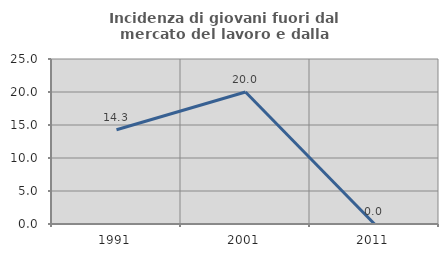
| Category | Incidenza di giovani fuori dal mercato del lavoro e dalla formazione  |
|---|---|
| 1991.0 | 14.286 |
| 2001.0 | 20 |
| 2011.0 | 0 |